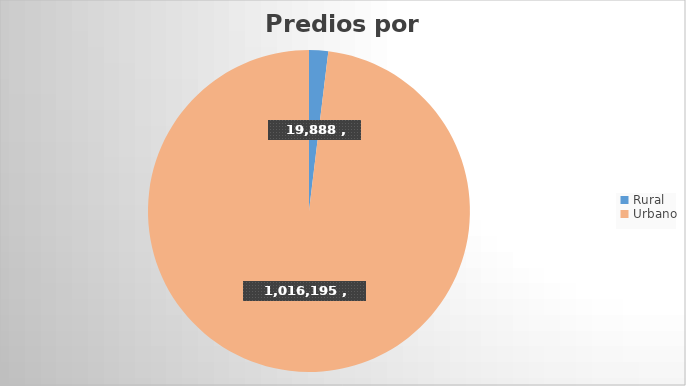
| Category | Predios |
|---|---|
| Rural | 19888 |
| Urbano | 1016195 |